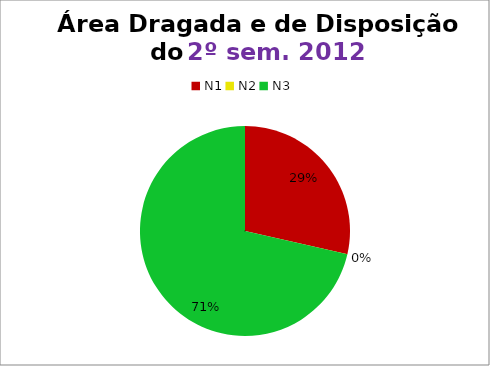
| Category | 2º/12 |
|---|---|
| N1 | 8 |
| N2 | 0 |
| N3 | 20 |